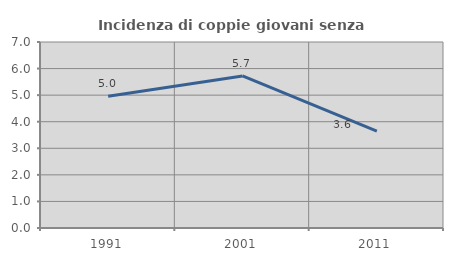
| Category | Incidenza di coppie giovani senza figli |
|---|---|
| 1991.0 | 4.962 |
| 2001.0 | 5.724 |
| 2011.0 | 3.642 |